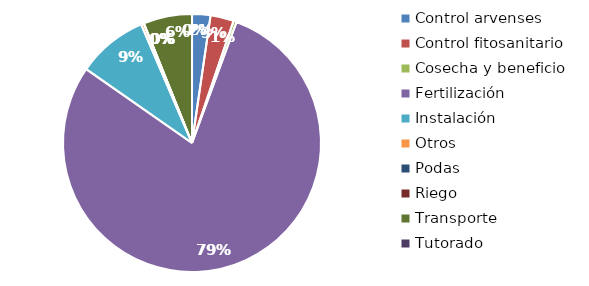
| Category | Valor |
|---|---|
| Control arvenses | 489000 |
| Control fitosanitario | 620000 |
| Cosecha y beneficio | 84000 |
| Fertilización | 16793478 |
| Instalación | 1879464 |
| Otros | 75000 |
| Podas | 0 |
| Riego | 0 |
| Transporte | 1295000 |
| Tutorado | 0 |